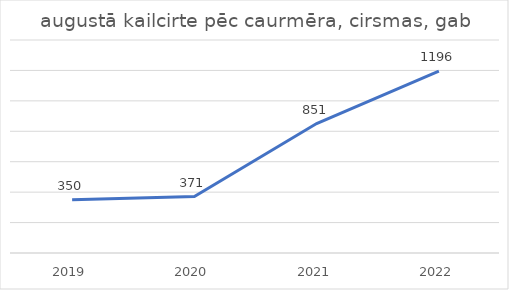
| Category | augustā kailcirte pēc caurmēra, cirsmas, gab |
|---|---|
| 2019.0 | 350 |
| 2020.0 | 371 |
| 2021.0 | 851 |
| 2022.0 | 1196 |